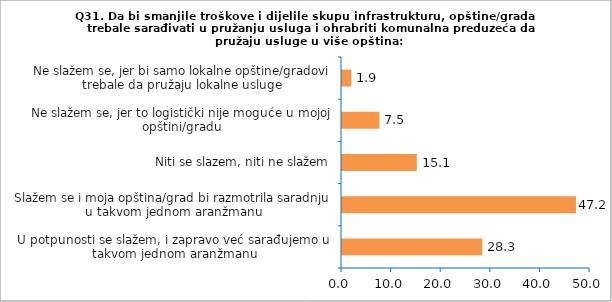
| Category | Series 0 |
|---|---|
| U potpunosti se slažem, i zapravo već sarađujemo u takvom jednom aranžmanu | 28.302 |
| Slažem se i moja opština/grad bi razmotrila saradnju u takvom jednom aranžmanu | 47.17 |
| Niti se slazem, niti ne slažem | 15.094 |
| Ne slažem se, jer to logistički nije moguće u mojoj opštini/gradu | 7.547 |
| Ne slažem se, jer bi samo lokalne opštine/gradovi trebale da pružaju lokalne usluge | 1.887 |